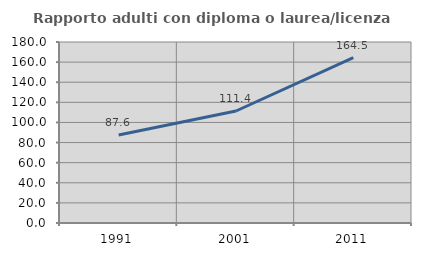
| Category | Rapporto adulti con diploma o laurea/licenza media  |
|---|---|
| 1991.0 | 87.591 |
| 2001.0 | 111.382 |
| 2011.0 | 164.456 |